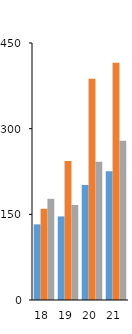
| Category | 31-90 d | 91-210 d | +211 d |
|---|---|---|---|
| 18 | 132.443 | 159.751 | 177.103 |
| 19 | 146.366 | 243.529 | 166.396 |
| 20 | 201.475 | 387.462 | 241.874 |
| 21 | 225.455 | 415.424 | 278.895 |